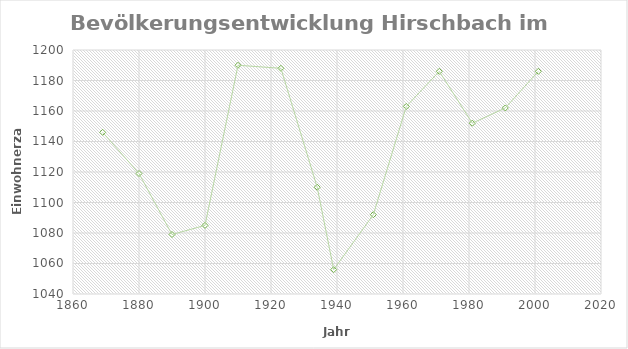
| Category | Series 0 |
|---|---|
| 1869.0 | 1146 |
| 1880.0 | 1119 |
| 1890.0 | 1079 |
| 1900.0 | 1085 |
| 1910.0 | 1190 |
| 1923.0 | 1188 |
| 1934.0 | 1110 |
| 1939.0 | 1056 |
| 1951.0 | 1092 |
| 1961.0 | 1163 |
| 1971.0 | 1186 |
| 1981.0 | 1152 |
| 1991.0 | 1162 |
| 2001.0 | 1186 |